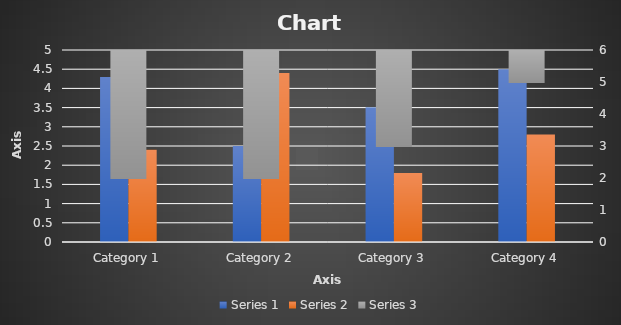
| Category | Series 1 | Series 2 |
|---|---|---|
| Category 1 | 4.3 | 2.4 |
| Category 2 | 2.5 | 4.4 |
| Category 3 | 3.5 | 1.8 |
| Category 4 | 4.5 | 2.8 |